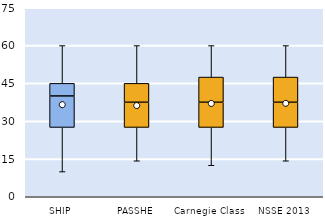
| Category | 25th | 50th | 75th |
|---|---|---|---|
| SHIP | 27.5 | 12.5 | 5 |
| PASSHE | 27.5 | 10 | 7.5 |
| Carnegie Class | 27.5 | 10 | 10 |
| NSSE 2013 | 27.5 | 10 | 10 |